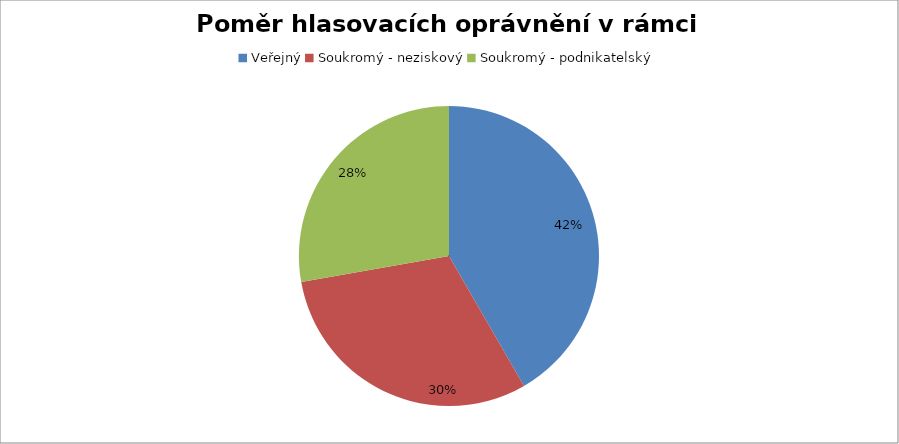
| Category | Series 0 |
|---|---|
| Veřejný | 0.417 |
| Soukromý - neziskový | 0.306 |
| Soukromý - podnikatelský | 0.278 |